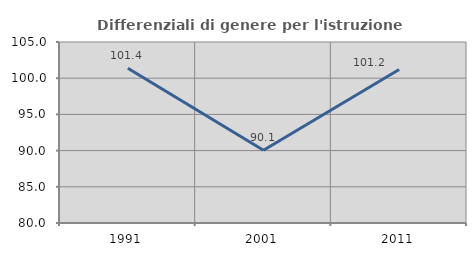
| Category | Differenziali di genere per l'istruzione superiore |
|---|---|
| 1991.0 | 101.364 |
| 2001.0 | 90.054 |
| 2011.0 | 101.191 |